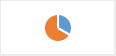
| Category | Section 2.A : Programmation, réalisation et suivi des actions mises en œuvre |
|---|---|
| 0 | 0.333 |
| 1 | 0.667 |